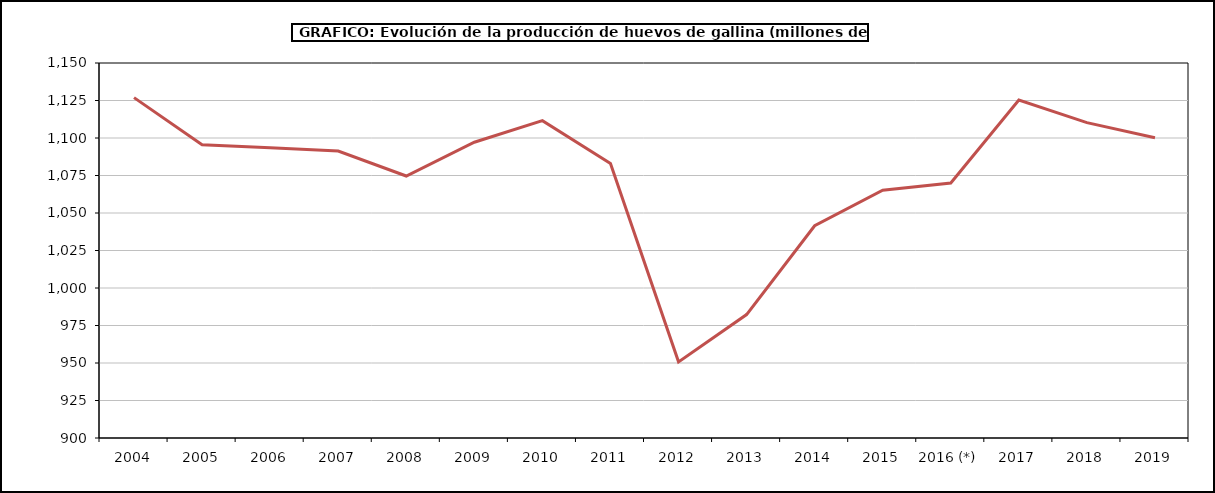
| Category | Series 1 |
|---|---|
| 2004 | 1126.913 |
| 2005 | 1095.445 |
| 2006 | 1093.512 |
| 2007 | 1091.274 |
| 2008 | 1074.66 |
| 2009 | 1097.178 |
| 2010 | 1111.55 |
| 2011 | 1082.947 |
| 2012 | 950.76 |
| 2013 | 982.284 |
| 2014 | 1041.475 |
| 2015 | 1065.149 |
| 2016 (*) | 1070 |
| 2017 | 1125.285 |
| 2018 | 1110.247 |
| 2019 | 1100.133 |